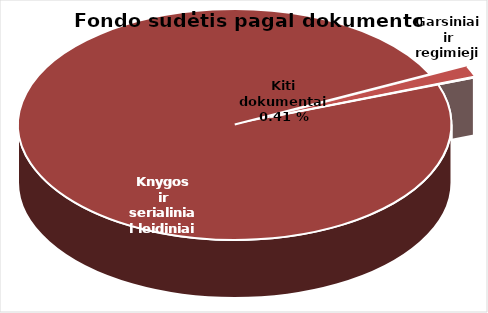
| Category | Series 0 |
|---|---|
| Knygos ir serialiniai | 1781947 |
| Garsiniai ir regimieji | 27985 |
| Kiti dokumentai | 1350 |